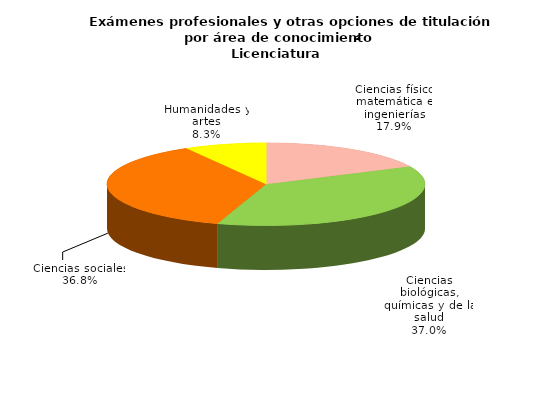
| Category | Series 0 |
|---|---|
| Ciencias físico matemática e ingenierías | 4078 |
| Ciencias biológicas, químicas y de la salud | 8452 |
| Ciencias sociales | 8390 |
| Humanidades y artes | 1895 |